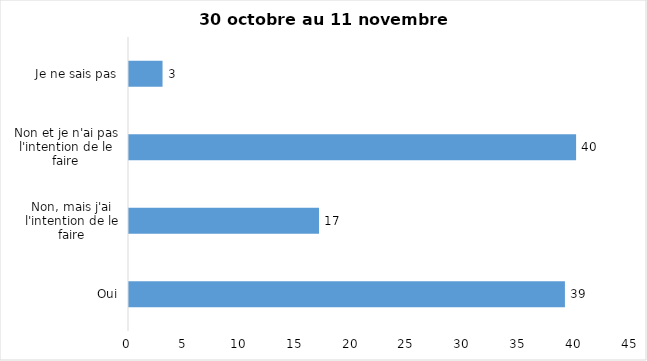
| Category | Series 0 |
|---|---|
| Oui | 39 |
| Non, mais j'ai l'intention de le faire | 17 |
| Non et je n'ai pas l'intention de le faire | 40 |
| Je ne sais pas | 3 |